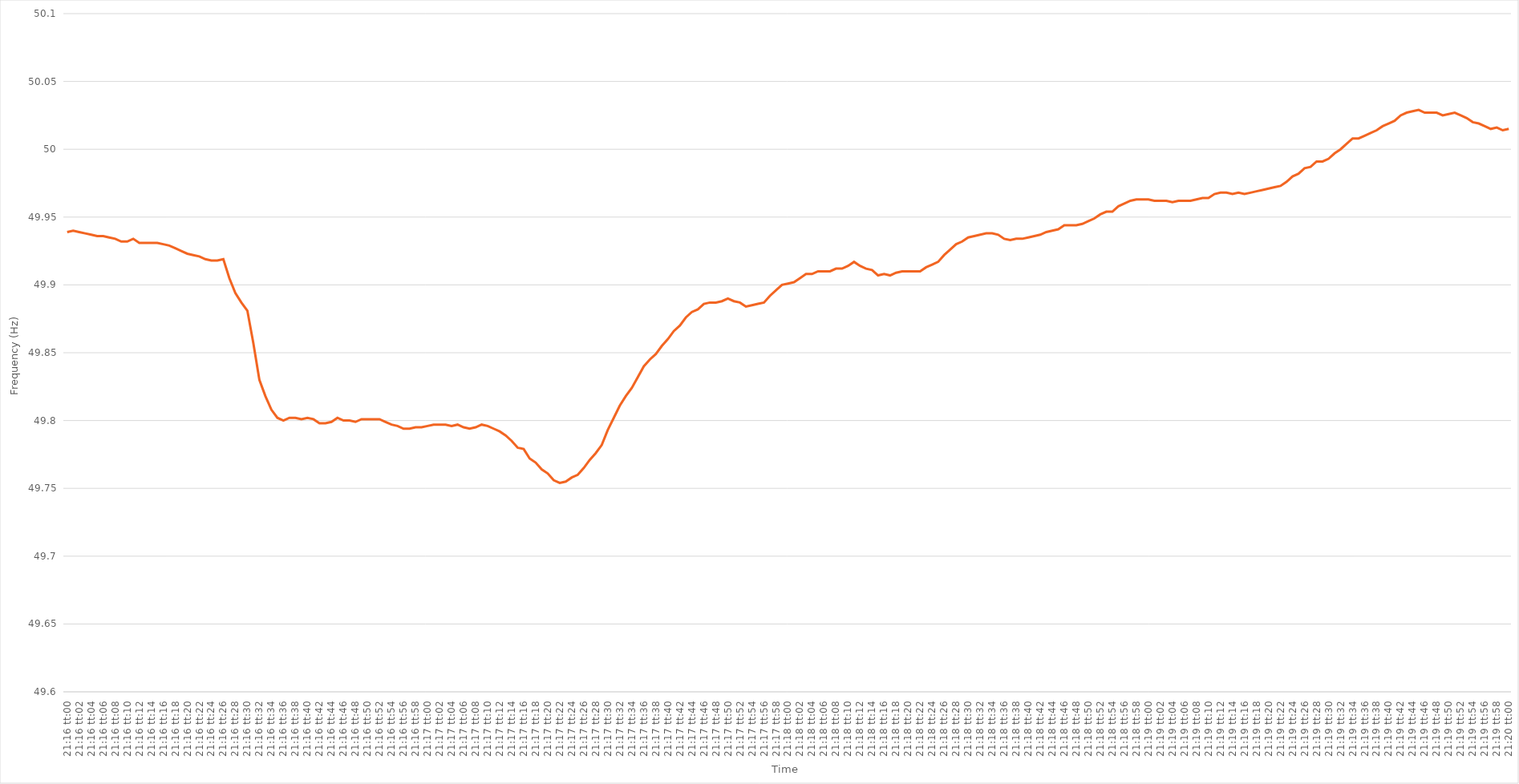
| Category | Series 0 |
|---|---|
| 0.8861111111111111 | 49.939 |
| 0.8861226851851852 | 49.94 |
| 0.8861342592592593 | 49.939 |
| 0.8861458333333333 | 49.938 |
| 0.8861574074074073 | 49.937 |
| 0.8861689814814815 | 49.936 |
| 0.8861805555555556 | 49.936 |
| 0.8861921296296296 | 49.935 |
| 0.8862037037037037 | 49.934 |
| 0.8862152777777778 | 49.932 |
| 0.8862268518518519 | 49.932 |
| 0.8862384259259258 | 49.934 |
| 0.88625 | 49.931 |
| 0.8862615740740741 | 49.931 |
| 0.8862731481481482 | 49.931 |
| 0.8862847222222222 | 49.931 |
| 0.8862962962962962 | 49.93 |
| 0.8863078703703704 | 49.929 |
| 0.8863194444444445 | 49.927 |
| 0.8863310185185185 | 49.925 |
| 0.8863425925925926 | 49.923 |
| 0.8863541666666667 | 49.922 |
| 0.8863657407407407 | 49.921 |
| 0.8863773148148147 | 49.919 |
| 0.8863888888888889 | 49.918 |
| 0.886400462962963 | 49.918 |
| 0.886412037037037 | 49.919 |
| 0.8864236111111111 | 49.905 |
| 0.8864351851851852 | 49.894 |
| 0.8864467592592593 | 49.887 |
| 0.8864583333333332 | 49.881 |
| 0.8864699074074074 | 49.857 |
| 0.8864814814814815 | 49.83 |
| 0.8864930555555556 | 49.818 |
| 0.8865046296296296 | 49.808 |
| 0.8865162037037037 | 49.802 |
| 0.8865277777777778 | 49.8 |
| 0.886539351851852 | 49.802 |
| 0.8865509259259259 | 49.802 |
| 0.8865625 | 49.801 |
| 0.8865740740740741 | 49.802 |
| 0.8865856481481482 | 49.801 |
| 0.8865972222222221 | 49.798 |
| 0.8866087962962963 | 49.798 |
| 0.8866203703703704 | 49.799 |
| 0.8866319444444444 | 49.802 |
| 0.8866435185185185 | 49.8 |
| 0.8866550925925926 | 49.8 |
| 0.8866666666666667 | 49.799 |
| 0.8866782407407406 | 49.801 |
| 0.8866898148148148 | 49.801 |
| 0.8867013888888889 | 49.801 |
| 0.886712962962963 | 49.801 |
| 0.886724537037037 | 49.799 |
| 0.8867361111111111 | 49.797 |
| 0.8867476851851852 | 49.796 |
| 0.8867592592592594 | 49.794 |
| 0.8867708333333333 | 49.794 |
| 0.8867824074074074 | 49.795 |
| 0.8867939814814815 | 49.795 |
| 0.8868055555555556 | 49.796 |
| 0.8868171296296296 | 49.797 |
| 0.8868287037037037 | 49.797 |
| 0.8868402777777779 | 49.797 |
| 0.8868518518518518 | 49.796 |
| 0.8868634259259259 | 49.797 |
| 0.886875 | 49.795 |
| 0.8868865740740741 | 49.794 |
| 0.886898148148148 | 49.795 |
| 0.8869097222222222 | 49.797 |
| 0.8869212962962963 | 49.796 |
| 0.8869328703703704 | 49.794 |
| 0.8869444444444444 | 49.792 |
| 0.8869560185185185 | 49.789 |
| 0.8869675925925926 | 49.785 |
| 0.8869791666666668 | 49.78 |
| 0.8869907407407407 | 49.779 |
| 0.8870023148148148 | 49.772 |
| 0.8870138888888889 | 49.769 |
| 0.887025462962963 | 49.764 |
| 0.887037037037037 | 49.761 |
| 0.8870486111111111 | 49.756 |
| 0.8870601851851853 | 49.754 |
| 0.8870717592592593 | 49.755 |
| 0.8870833333333333 | 49.758 |
| 0.8870949074074074 | 49.76 |
| 0.8871064814814815 | 49.765 |
| 0.8871180555555555 | 49.771 |
| 0.8871296296296296 | 49.776 |
| 0.8871412037037038 | 49.782 |
| 0.8871527777777778 | 49.793 |
| 0.8871643518518518 | 49.802 |
| 0.8871759259259259 | 49.811 |
| 0.8871875 | 49.818 |
| 0.8871990740740742 | 49.824 |
| 0.8872106481481481 | 49.832 |
| 0.8872222222222222 | 49.84 |
| 0.8872337962962963 | 49.845 |
| 0.8872453703703704 | 49.849 |
| 0.8872569444444444 | 49.855 |
| 0.8872685185185185 | 49.86 |
| 0.8872800925925927 | 49.866 |
| 0.8872916666666667 | 49.87 |
| 0.8873032407407407 | 49.876 |
| 0.8873148148148148 | 49.88 |
| 0.8873263888888889 | 49.882 |
| 0.8873379629629629 | 49.886 |
| 0.887349537037037 | 49.887 |
| 0.8873611111111112 | 49.887 |
| 0.8873726851851852 | 49.888 |
| 0.8873842592592592 | 49.89 |
| 0.8873958333333333 | 49.888 |
| 0.8874074074074074 | 49.887 |
| 0.8874189814814816 | 49.884 |
| 0.8874305555555555 | 49.885 |
| 0.8874421296296297 | 49.886 |
| 0.8874537037037037 | 49.887 |
| 0.8874652777777778 | 49.892 |
| 0.8874768518518518 | 49.896 |
| 0.8874884259259259 | 49.9 |
| 0.8875000000000001 | 49.901 |
| 0.8875115740740741 | 49.902 |
| 0.8875231481481481 | 49.905 |
| 0.8875347222222222 | 49.908 |
| 0.8875462962962963 | 49.908 |
| 0.8875578703703703 | 49.91 |
| 0.8875694444444444 | 49.91 |
| 0.8875810185185186 | 49.91 |
| 0.8875925925925926 | 49.912 |
| 0.8876041666666666 | 49.912 |
| 0.8876157407407407 | 49.914 |
| 0.8876273148148148 | 49.917 |
| 0.887638888888889 | 49.914 |
| 0.8876504629629629 | 49.912 |
| 0.887662037037037 | 49.911 |
| 0.8876736111111111 | 49.907 |
| 0.8876851851851852 | 49.908 |
| 0.8876967592592592 | 49.907 |
| 0.8877083333333333 | 49.909 |
| 0.8877199074074075 | 49.91 |
| 0.8877314814814815 | 49.91 |
| 0.8877430555555555 | 49.91 |
| 0.8877546296296296 | 49.91 |
| 0.8877662037037037 | 49.913 |
| 0.8877777777777777 | 49.915 |
| 0.8877893518518518 | 49.917 |
| 0.887800925925926 | 49.922 |
| 0.8878125 | 49.926 |
| 0.887824074074074 | 49.93 |
| 0.8878356481481481 | 49.932 |
| 0.8878472222222222 | 49.935 |
| 0.8878587962962964 | 49.936 |
| 0.8878703703703703 | 49.937 |
| 0.8878819444444445 | 49.938 |
| 0.8878935185185185 | 49.938 |
| 0.8879050925925926 | 49.937 |
| 0.8879166666666666 | 49.934 |
| 0.8879282407407407 | 49.933 |
| 0.8879398148148149 | 49.934 |
| 0.8879513888888889 | 49.934 |
| 0.887962962962963 | 49.935 |
| 0.887974537037037 | 49.936 |
| 0.8879861111111111 | 49.937 |
| 0.8879976851851853 | 49.939 |
| 0.8880092592592592 | 49.94 |
| 0.8880208333333334 | 49.941 |
| 0.8880324074074074 | 49.944 |
| 0.8880439814814814 | 49.944 |
| 0.8880555555555555 | 49.944 |
| 0.8880671296296296 | 49.945 |
| 0.8880787037037038 | 49.947 |
| 0.8880902777777777 | 49.949 |
| 0.8881018518518519 | 49.952 |
| 0.8881134259259259 | 49.954 |
| 0.888125 | 49.954 |
| 0.888136574074074 | 49.958 |
| 0.8881481481481481 | 49.96 |
| 0.8881597222222223 | 49.962 |
| 0.8881712962962963 | 49.963 |
| 0.8881828703703704 | 49.963 |
| 0.8881944444444444 | 49.963 |
| 0.8882060185185185 | 49.962 |
| 0.8882175925925927 | 49.962 |
| 0.8882291666666666 | 49.962 |
| 0.8882407407407408 | 49.961 |
| 0.8882523148148148 | 49.962 |
| 0.888263888888889 | 49.962 |
| 0.8882754629629629 | 49.962 |
| 0.888287037037037 | 49.963 |
| 0.8882986111111112 | 49.964 |
| 0.8883101851851851 | 49.964 |
| 0.8883217592592593 | 49.967 |
| 0.8883333333333333 | 49.968 |
| 0.8883449074074075 | 49.968 |
| 0.8883564814814814 | 49.967 |
| 0.8883680555555555 | 49.968 |
| 0.8883796296296297 | 49.967 |
| 0.8883912037037037 | 49.968 |
| 0.8884027777777778 | 49.969 |
| 0.8884143518518518 | 49.97 |
| 0.888425925925926 | 49.971 |
| 0.8884375000000001 | 49.972 |
| 0.888449074074074 | 49.973 |
| 0.8884606481481482 | 49.976 |
| 0.8884722222222222 | 49.98 |
| 0.8884837962962964 | 49.982 |
| 0.8884953703703703 | 49.986 |
| 0.8885069444444444 | 49.987 |
| 0.8885185185185186 | 49.991 |
| 0.8885300925925925 | 49.991 |
| 0.8885416666666667 | 49.993 |
| 0.8885532407407407 | 49.997 |
| 0.8885648148148149 | 50 |
| 0.8885763888888888 | 50.004 |
| 0.8885879629629629 | 50.008 |
| 0.8885995370370371 | 50.008 |
| 0.8886111111111111 | 50.01 |
| 0.8886226851851852 | 50.012 |
| 0.8886342592592592 | 50.014 |
| 0.8886458333333334 | 50.017 |
| 0.8886574074074075 | 50.019 |
| 0.8886689814814814 | 50.021 |
| 0.8886805555555556 | 50.025 |
| 0.8886921296296296 | 50.027 |
| 0.8887037037037038 | 50.028 |
| 0.8887152777777777 | 50.029 |
| 0.8887268518518519 | 50.027 |
| 0.888738425925926 | 50.027 |
| 0.8887499999999999 | 50.027 |
| 0.8887615740740741 | 50.025 |
| 0.8887731481481481 | 50.026 |
| 0.8887847222222223 | 50.027 |
| 0.8887962962962962 | 50.025 |
| 0.8888078703703703 | 50.023 |
| 0.8888194444444445 | 50.02 |
| 0.8888310185185185 | 50.019 |
| 0.8888425925925926 | 50.017 |
| 0.8888541666666666 | 50.015 |
| 0.8888657407407408 | 50.016 |
| 0.8888773148148149 | 50.014 |
| 0.8888888888888888 | 50.015 |